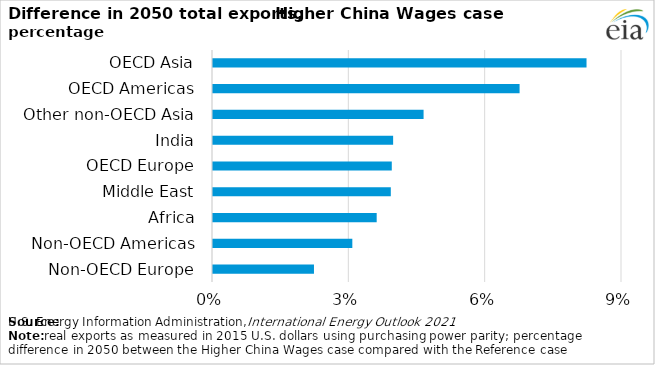
| Category | Series 0 |
|---|---|
| Non-OECD Europe | 0.022 |
| Non-OECD Americas | 0.031 |
| Africa | 0.036 |
| Middle East | 0.039 |
| OECD Europe | 0.039 |
| India | 0.04 |
| Other non-OECD Asia | 0.046 |
| OECD Americas | 0.067 |
| OECD Asia | 0.082 |